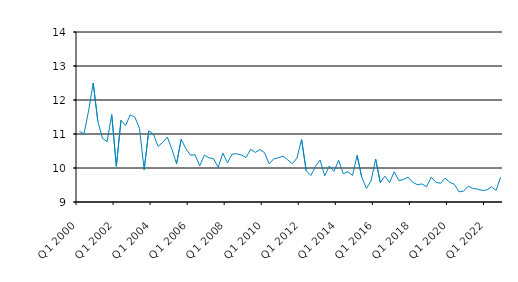
| Category | Series 0 |
|---|---|
| Q1 2000 | 11.08 |
| Q2 2000 | 11 |
| Q3 2000 | 11.679 |
| Q4 2000 | 12.5 |
| Q1 2001 | 11.375 |
| Q2 2001 | 10.875 |
| Q3 2001 | 10.775 |
| Q4 2001 | 11.57 |
| Q1 2002 | 10.05 |
| Q2 2002 | 11.405 |
| Q3 2002 | 11.25 |
| Q4 2002 | 11.566 |
| Q1 2003 | 11.492 |
| Q2 2003 | 11.162 |
| Q3 2003 | 9.95 |
| Q4 2003 | 11.091 |
| Q1 2004 | 11 |
| Q2 2004 | 10.638 |
| Q3 2004 | 10.75 |
| Q4 2004 | 10.908 |
| Q1 2005 | 10.55 |
| Q2 2005 | 10.125 |
| Q3 2005 | 10.843 |
| Q4 2005 | 10.573 |
| Q1 2006 | 10.38 |
| Q2 2006 | 10.387 |
| Q3 2006 | 10.06 |
| Q4 2006 | 10.38 |
| Q1 2007 | 10.3 |
| Q2 2007 | 10.27 |
| Q3 2007 | 10.017 |
| Q4 2007 | 10.44 |
| Q1 2008 | 10.15 |
| Q2 2008 | 10.41 |
| Q3 2008 | 10.42 |
| Q4 2008 | 10.38 |
| Q1 2009 | 10.31 |
| Q2 2009 | 10.55 |
| Q3 2009 | 10.46 |
| Q4 2009 | 10.54 |
| Q1 2010 | 10.45 |
| Q2 2010 | 10.12 |
| Q3 2010 | 10.27 |
| Q4 2010 | 10.3 |
| Q1 2011 | 10.35 |
| Q2 2011 | 10.24 |
| Q3 2011 | 10.125 |
| Q4 2011 | 10.29 |
| Q1 2012 | 10.84 |
| Q2 2012 | 9.92 |
| Q3 2012 | 9.78 |
| Q4 2012 | 10.05 |
| Q1 2013 | 10.23 |
| Q2 2013 | 9.77 |
| Q3 2013 | 10.06 |
| Q4 2013 | 9.9 |
| Q1 2014 | 10.23 |
| Q2 2014 | 9.83 |
| Q3 2014 | 9.89 |
| Q4 2014 | 9.78 |
| Q1 2015 | 10.37 |
| Q2 2015 | 9.726 |
| Q3 2015 | 9.4 |
| Q4 2015 | 9.62 |
| Q1 2016 | 10.26 |
| Q2 2016 | 9.57 |
| Q3 2016 | 9.76 |
| Q4 2016 | 9.57 |
| Q1 2017 | 9.89 |
| Q2 2017 | 9.63 |
| Q3 2017 | 9.66 |
| Q4 2017 | 9.73 |
| Q1 2018 | 9.58 |
| Q2 2018 | 9.51 |
| Q3 2018 | 9.53 |
| Q4 2018 | 9.45 |
| Q1 2019 | 9.73 |
| Q2 2019 | 9.58 |
| Q3 2019 | 9.55 |
| Q4 2019 | 9.7 |
| Q1 2020 | 9.58 |
| Q2 2020 | 9.52 |
| Q3 2020 | 9.3 |
| Q4 2020 | 9.32 |
| Q1 2021 | 9.464 |
| Q2 2021 | 9.4 |
| Q3 2021 | 9.38 |
| Q4 2021 | 9.34 |
| Q1 2022 | 9.354 |
| Q2 2022 | 9.45 |
| Q3 2022 | 9.34 |
| Q4 2022 | 9.73 |